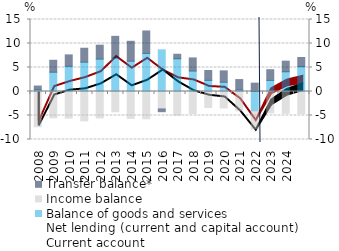
| Category | Balance of goods and services | Income balance | Transfer balance* |
|---|---|---|---|
| 2008.0 | 0.347 | -7.341 | 0.795 |
| 2009.0 | 4.021 | -5.478 | 2.483 |
| 2010.0 | 5.256 | -5.542 | 2.369 |
| 2011.0 | 6.11 | -6.105 | 2.903 |
| 2012.0 | 6.752 | -5.517 | 2.896 |
| 2013.0 | 6.971 | -4.229 | 4.521 |
| 2014.0 | 6.316 | -5.598 | 4.145 |
| 2015.0 | 7.94 | -5.691 | 4.671 |
| 2016.0 | 8.675 | -3.642 | -0.569 |
| 2017.0 | 6.819 | -4.916 | 0.941 |
| 2018.0 | 4.262 | -4.583 | 2.731 |
| 2019.0 | 2.325 | -3.325 | 2.048 |
| 2020.0 | 1.936 | -3.434 | 2.364 |
| 2021.0 | 0.316 | -4.009 | 2.169 |
| 2022.0 | -4.021 | -3.759 | 1.737 |
| 2023.0 | 2.317 | -4.468 | 2.218 |
| 2024.0 | 4.113 | -4.565 | 2.209 |
| 2025.0 | 5.178 | -4.615 | 1.901 |